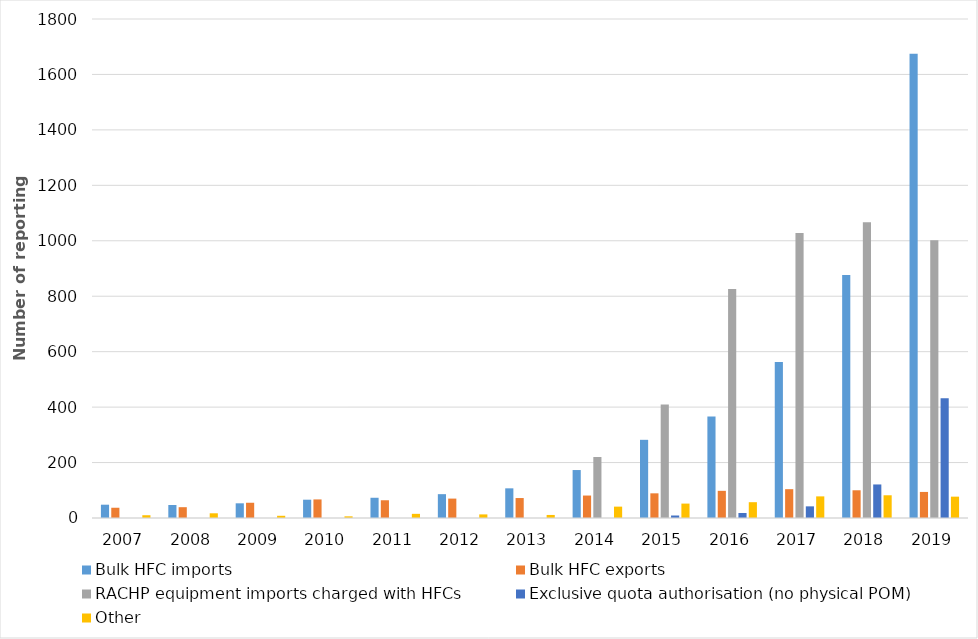
| Category | Bulk HFC imports | Bulk HFC exports | RACHP equipment imports charged with HFCs | Exclusive quota authorisation (no physical POM) | Other |
|---|---|---|---|---|---|
| 2007.0 | 48 | 37 | 0 | 0 | 10 |
| 2008.0 | 47 | 39 | 0 | 0 | 17 |
| 2009.0 | 53 | 55 | 0 | 0 | 8 |
| 2010.0 | 66 | 67 | 0 | 0 | 6 |
| 2011.0 | 73 | 64 | 0 | 0 | 15 |
| 2012.0 | 86 | 70 | 0 | 0 | 13 |
| 2013.0 | 107 | 72 | 0 | 0 | 11 |
| 2014.0 | 173 | 81 | 220 | 0 | 41 |
| 2015.0 | 282 | 89 | 409 | 9 | 52 |
| 2016.0 | 366 | 98 | 826 | 18 | 57 |
| 2017.0 | 563 | 104 | 1028 | 42 | 78 |
| 2018.0 | 877 | 100 | 1067 | 121 | 82 |
| 2019.0 | 1675 | 94 | 1002 | 432 | 77 |